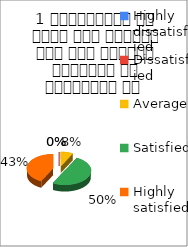
| Category | 1 व्याख्यान से रूचि में वृद्धि हुई एवं शिक्षण जानकारी से परिपूर्ण था  |
|---|---|
| Highly dissatisfied | 0 |
| Dissatisfied | 0 |
| Average | 3 |
| Satisfied | 20 |
| Highly satisfied | 17 |